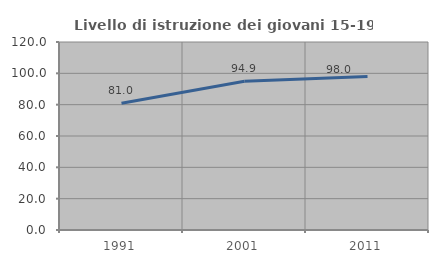
| Category | Livello di istruzione dei giovani 15-19 anni |
|---|---|
| 1991.0 | 80.958 |
| 2001.0 | 94.929 |
| 2011.0 | 98.001 |